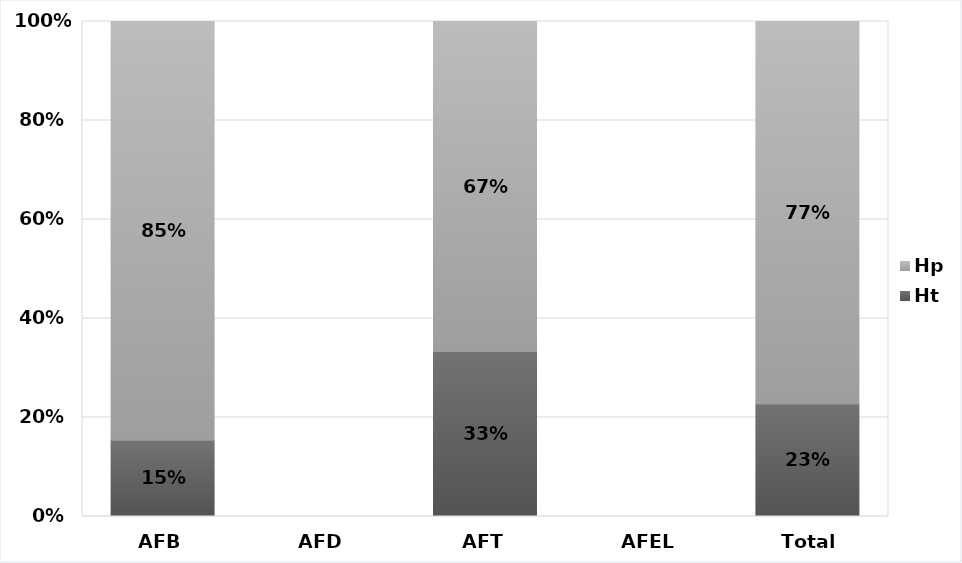
| Category | Ht | Hp |
|---|---|---|
| AFB | 0.154 | 0.846 |
| AFD | 0 | 0 |
| AFT | 0.333 | 0.667 |
| AFEL | 0 | 0 |
| Total | 0.227 | 0.773 |